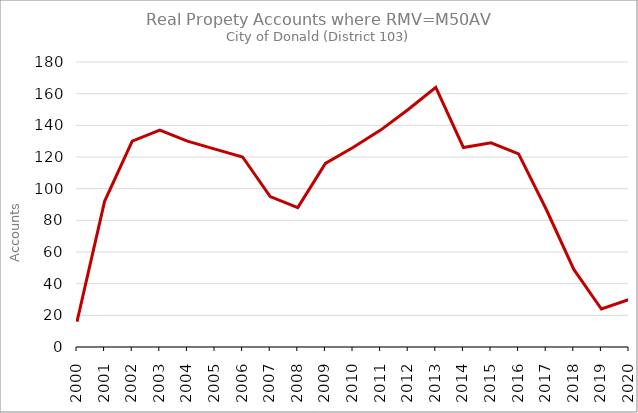
| Category | Series 0 |
|---|---|
| 2000.0 | 16 |
| 2001.0 | 92 |
| 2002.0 | 130 |
| 2003.0 | 137 |
| 2004.0 | 130 |
| 2005.0 | 125 |
| 2006.0 | 120 |
| 2007.0 | 95 |
| 2008.0 | 88 |
| 2009.0 | 116 |
| 2010.0 | 126 |
| 2011.0 | 137 |
| 2012.0 | 150 |
| 2013.0 | 164 |
| 2014.0 | 126 |
| 2015.0 | 129 |
| 2016.0 | 122 |
| 2017.0 | 87 |
| 2018.0 | 49 |
| 2019.0 | 24 |
| 2020.0 | 30 |